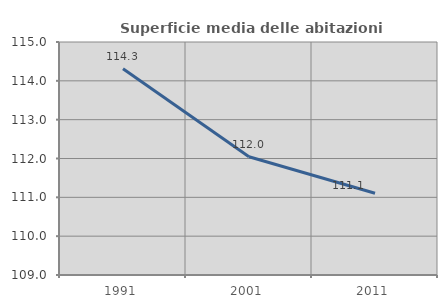
| Category | Superficie media delle abitazioni occupate |
|---|---|
| 1991.0 | 114.31 |
| 2001.0 | 112.046 |
| 2011.0 | 111.104 |